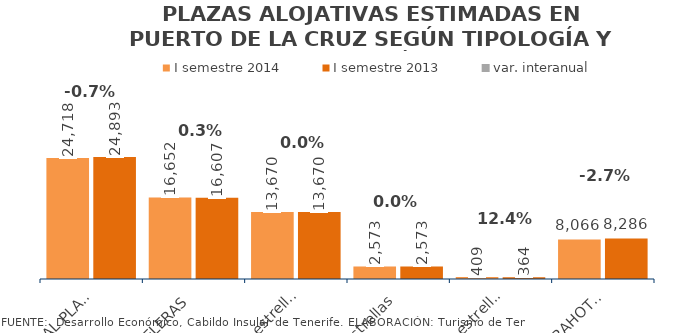
| Category | I semestre 2014 | I semestre 2013 |
|---|---|---|
| TOTAL PLAZAS | 24718 | 24893 |
| HOTELERAS | 16652 | 16607 |
| 4 y 5 estrellas | 13670 | 13670 |
| 3 estrellas | 2573 | 2573 |
| 1 Y 2 estrellas | 409 | 364 |
| EXTRAHOTELERAS | 8066 | 8286 |